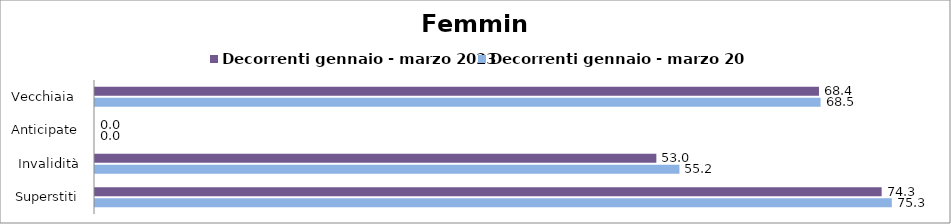
| Category | Decorrenti gennaio - marzo 2023 | Decorrenti gennaio - marzo 2024 |
|---|---|---|
| Vecchiaia  | 68.38 | 68.53 |
| Anticipate | 0 | 0 |
| Invalidità | 53.02 | 55.2 |
| Superstiti | 74.3 | 75.26 |